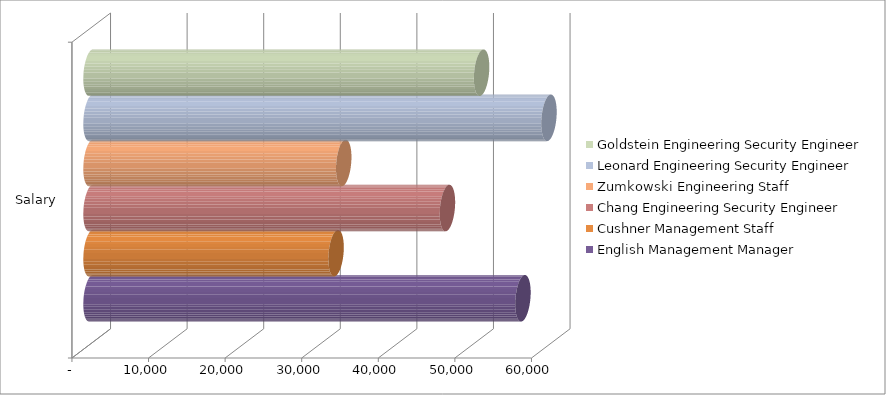
| Category | Grundies Marketing CSR | Gomez Marketing CSR | Flintsteel Marketing Staff | Andretti Marketing CSR | Manispour Engineering Security Engineer | Kurzweil Management Manager | Grabowski Management Manager | Van Horn Management Manager | Lambros Marketing CSR | English Management Manager | Rothrock Engineering Security Engineer | Cushner Management Staff | Pacioli Marketing Staff | Chang Engineering Security Engineer | Mehta Engineering Security Engineer | Detweiler Engineering Security Engineer | Yamamoto Engineering Security Engineer | Zumkowski Engineering Staff | Leonard Engineering Security Engineer | Gates Engineering Security Engineer | Goldstein Engineering Security Engineer |
|---|---|---|---|---|---|---|---|---|---|---|---|---|---|---|---|---|---|---|---|---|---|
| Salary |  |  |  |  |  |  |  |  |  | 56400 |  | 32000 |  | 46540 |  |  |  | 33000 | 59800 |  | 51000 |